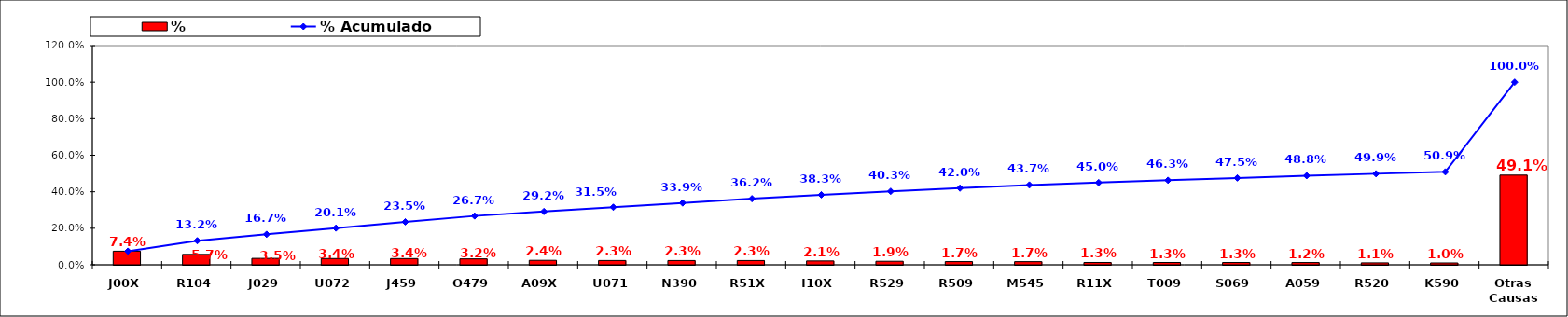
| Category | % |
|---|---|
| J00X | 0.074 |
| R104 | 0.057 |
| J029 | 0.035 |
| U072 | 0.034 |
| J459 | 0.034 |
| O479 | 0.032 |
| A09X | 0.024 |
| U071 | 0.023 |
| N390 | 0.023 |
| R51X | 0.023 |
| I10X | 0.021 |
| R529 | 0.019 |
| R509 | 0.017 |
| M545 | 0.017 |
| R11X | 0.013 |
| T009 | 0.013 |
| S069 | 0.013 |
| A059 | 0.012 |
| R520 | 0.011 |
| K590 | 0.01 |
| Otras Causas | 0.491 |